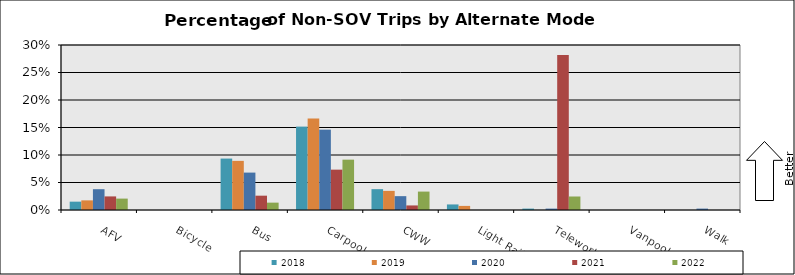
| Category | 2018 | 2019 | 2020 | 2021 | 2022 |
|---|---|---|---|---|---|
| AFV | 0.015 | 0.018 | 0.038 | 0.025 | 0.021 |
| Bicycle | 0 | 0 | 0 | 0 | 0 |
| Bus | 0.094 | 0.089 | 0.068 | 0.026 | 0.013 |
| Carpool | 0.152 | 0.166 | 0.146 | 0.073 | 0.092 |
| CWW | 0.038 | 0.035 | 0.025 | 0.008 | 0.033 |
| Light Rail | 0.01 | 0.007 | 0 | 0 | 0 |
| Telework | 0.003 | 0 | 0.003 | 0.282 | 0.025 |
| Vanpool | 0 | 0 | 0 | 0 | 0 |
| Walk | 0 | 0 | 0.003 | 0 | 0 |